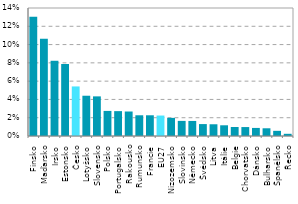
| Category | Series 0 |
|---|---|
| Finsko | 0.13 |
| Maďarsko | 0.106 |
| Irsko | 0.082 |
| Estonsko | 0.079 |
| Česko | 0.054 |
| Lotyšsko | 0.044 |
| Slovensko | 0.043 |
| Polsko | 0.027 |
| Portugalsko | 0.027 |
| Rakousko | 0.027 |
| Rumunsko | 0.023 |
| Francie | 0.023 |
| EU27 | 0.022 |
| Nizozemsko | 0.02 |
| Slovinsko | 0.017 |
| Německo | 0.016 |
| Švédsko | 0.013 |
| Litva | 0.013 |
| Itálie | 0.012 |
| Belgie | 0.01 |
| Chorvatsko | 0.01 |
| Dánsko | 0.009 |
| Bulharsko | 0.008 |
| Španělsko | 0.006 |
| Řecko | 0.002 |